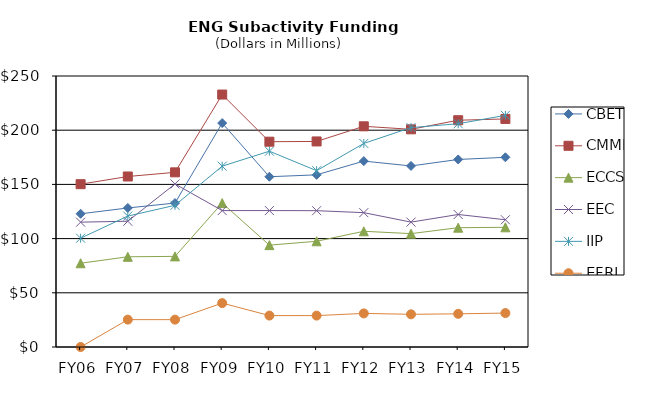
| Category | CBET | CMMI | ECCS | EEC | IIP  | EFRI |
|---|---|---|---|---|---|---|
| FY06 | 122.87 | 150.19 | 77.27 | 115.16 | 100.36 | 0 |
| FY07 | 128.27 | 157.3 | 83.24 | 116.02 | 120.78 | 25.25 |
| FY08 | 132.81 | 161.11 | 83.6 | 150.41 | 130.72 | 25.23 |
| FY09 | 206.57 | 232.89 | 132.78 | 125.86 | 166.82 | 40.5 |
| FY10 | 157.08 | 189.4 | 93.97 | 125.86 | 180.63 | 28.99 |
| FY11 | 158.82 | 189.62 | 97.54 | 125.76 | 162.65 | 28.95 |
| FY12 | 171.51 | 203.59 | 106.74 | 123.93 | 187.79 | 30.99 |
| FY13 | 167.014 | 200.807 | 104.584 | 115.208 | 202.408 | 30.156 |
| FY14 | 173 | 209.2 | 110.06 | 122.24 | 205.965 | 30.6 |
| FY15 | 174.99 | 210.4 | 110.41 | 117.38 | 213.69 | 31.3 |